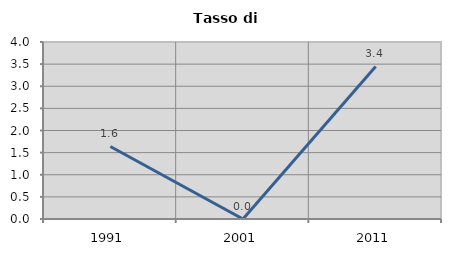
| Category | Tasso di disoccupazione   |
|---|---|
| 1991.0 | 1.639 |
| 2001.0 | 0 |
| 2011.0 | 3.448 |